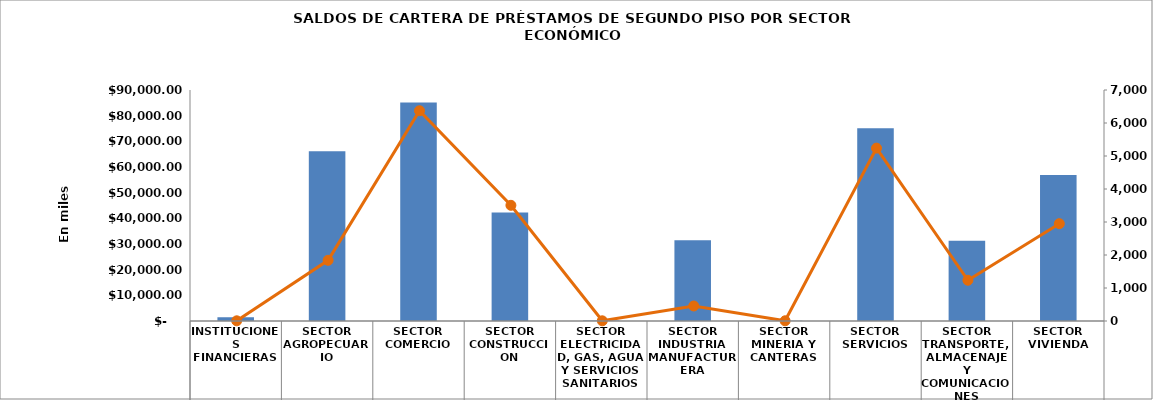
| Category |  Saldo del Crédito |
|---|---|
| INSTITUCIONES FINANCIERAS | 1414.05 |
| SECTOR AGROPECUARIO | 66181.271 |
| SECTOR COMERCIO | 85154.447 |
| SECTOR CONSTRUCCION | 42302.835 |
| SECTOR ELECTRICIDAD, GAS, AGUA Y SERVICIOS SANITARIOS | 227.358 |
| SECTOR INDUSTRIA MANUFACTURERA | 31478.124 |
| SECTOR MINERIA Y CANTERAS | 113.774 |
| SECTOR SERVICIOS | 75122.076 |
| SECTOR TRANSPORTE, ALMACENAJE Y COMUNICACIONES | 31301.951 |
| SECTOR VIVIENDA | 56879.227 |